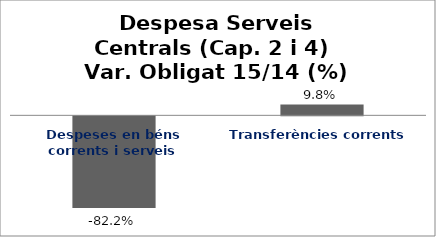
| Category | Series 0 |
|---|---|
| Despeses en béns corrents i serveis | -0.822 |
| Transferències corrents | 0.098 |